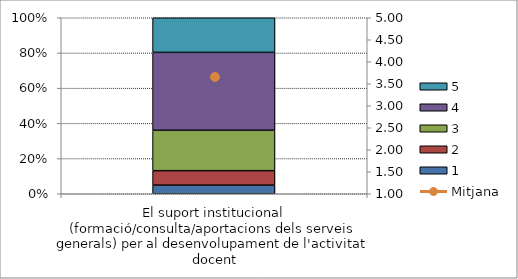
| Category | 1 | 2 | 3 | 4 | 5 |
|---|---|---|---|---|---|
| El suport institucional (formació/consulta/aportacions dels serveis generals) per al desenvolupament de l'activitat docent | 3 | 5 | 14 | 27 | 12 |